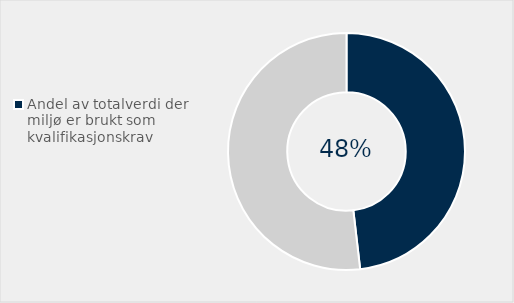
| Category | Series 0 |
|---|---|
| Andel av totalverdi der miljø er brukt som kvalifikasjonskrav | 0.482 |
| Ikke brukt miljø som kvalifikasjonskrav | 0.518 |